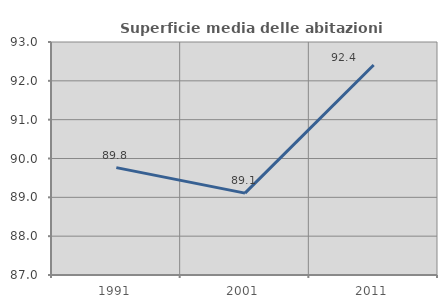
| Category | Superficie media delle abitazioni occupate |
|---|---|
| 1991.0 | 89.765 |
| 2001.0 | 89.108 |
| 2011.0 | 92.407 |